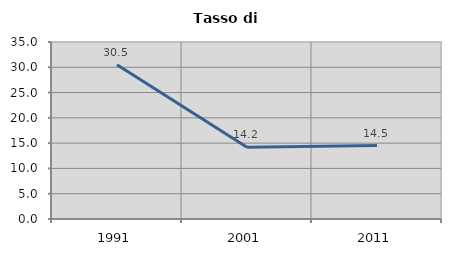
| Category | Tasso di disoccupazione   |
|---|---|
| 1991.0 | 30.495 |
| 2001.0 | 14.189 |
| 2011.0 | 14.526 |